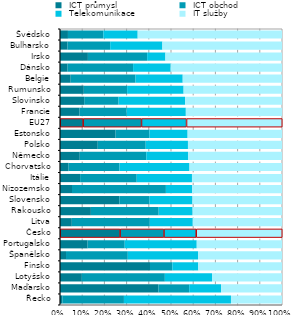
| Category |  ICT průmysl |  ICT obchod |  Telekomunikace |  IT služby |
|---|---|---|---|---|
| Řecko | 0.011 | 0.277 | 0.482 | 0.23 |
| Maďarsko | 0.443 | 0.139 | 0.144 | 0.274 |
| Lotyšsko | 0.098 | 0.374 | 0.213 | 0.315 |
| Finsko | 0.405 | 0.101 | 0.117 | 0.377 |
| Španělsko | 0.027 | 0.278 | 0.316 | 0.378 |
| Portugalsko | 0.124 | 0.167 | 0.324 | 0.384 |
| Česko | 0.27 | 0.198 | 0.145 | 0.387 |
| Litva | 0.053 | 0.351 | 0.194 | 0.402 |
| Rakousko | 0.139 | 0.305 | 0.153 | 0.403 |
| Slovensko | 0.267 | 0.136 | 0.193 | 0.403 |
| Nizozemsko | 0.054 | 0.423 | 0.118 | 0.405 |
| Itálie | 0.091 | 0.255 | 0.249 | 0.406 |
| Chorvatsko | 0.039 | 0.229 | 0.315 | 0.417 |
| Německo | 0.089 | 0.3 | 0.188 | 0.423 |
| Polsko | 0.17 | 0.216 | 0.19 | 0.424 |
| Estonsko | 0.25 | 0.152 | 0.172 | 0.425 |
| EU27 | 0.103 | 0.263 | 0.203 | 0.431 |
| Francie | 0.088 | 0.212 | 0.266 | 0.433 |
| Slovinsko | 0.109 | 0.155 | 0.3 | 0.436 |
| Rumunsko | 0.107 | 0.195 | 0.254 | 0.443 |
| Belgie | 0.048 | 0.292 | 0.213 | 0.447 |
| Dánsko | 0.034 | 0.295 | 0.169 | 0.501 |
| Irsko | 0.126 | 0.267 | 0.082 | 0.525 |
| Bulharsko | 0.034 | 0.192 | 0.235 | 0.539 |
| Švédsko | 0.036 | 0.16 | 0.155 | 0.65 |